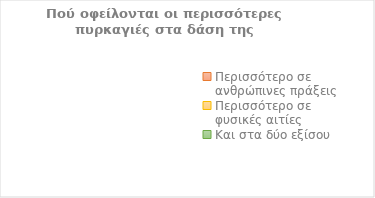
| Category | Series 0 |
|---|---|
| Περισσότερο σε ανθρώπινες πράξεις | 0 |
| Περισσότερο σε φυσικές αιτίες | 0 |
| Και στα δύο εξίσου | 0 |